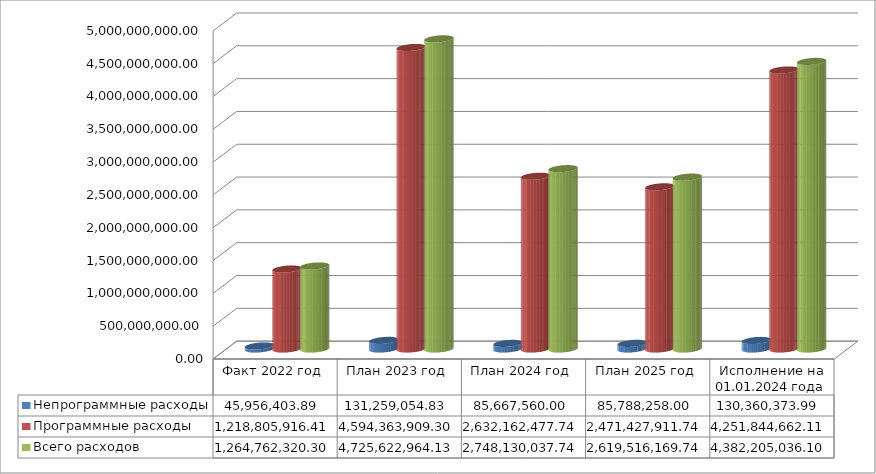
| Category | Непрограммные расходы | Программные расходы | Всего расходов |
|---|---|---|---|
| Факт 2022 год | 45956403.89 | 1218805916.41 | 1264762320.3 |
| План 2023 год | 131259054.83 | 4594363909.3 | 4725622964.13 |
| План 2024 год | 85667560 | 2632162477.74 | 2748130037.74 |
| План 2025 год | 85788258 | 2471427911.74 | 2619516169.74 |
| Исполнение на 01.01.2024 года | 130360373.99 | 4251844662.11 | 4382205036.1 |